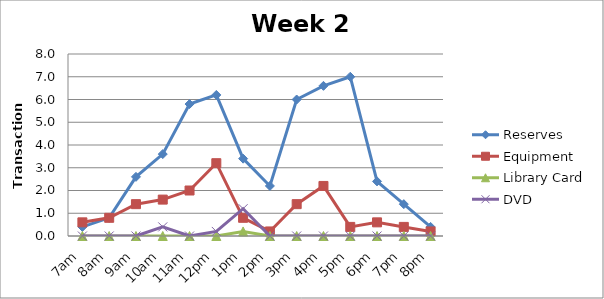
| Category | Reserves | Equipment | Library Card | DVD |
|---|---|---|---|---|
| 7am | 0.4 | 0.6 | 0 | 0 |
| 8am | 0.8 | 0.8 | 0 | 0 |
| 9am | 2.6 | 1.4 | 0 | 0 |
| 10am | 3.6 | 1.6 | 0 | 0.4 |
| 11am | 5.8 | 2 | 0 | 0 |
| 12pm | 6.2 | 3.2 | 0 | 0.2 |
| 1pm | 3.4 | 0.8 | 0.2 | 1.2 |
| 2pm | 2.2 | 0.2 | 0 | 0 |
| 3pm | 6 | 1.4 | 0 | 0 |
| 4pm | 6.6 | 2.2 | 0 | 0 |
| 5pm | 7 | 0.4 | 0 | 0 |
| 6pm | 2.4 | 0.6 | 0 | 0 |
| 7pm | 1.4 | 0.4 | 0 | 0 |
| 8pm | 0.4 | 0.2 | 0 | 0 |